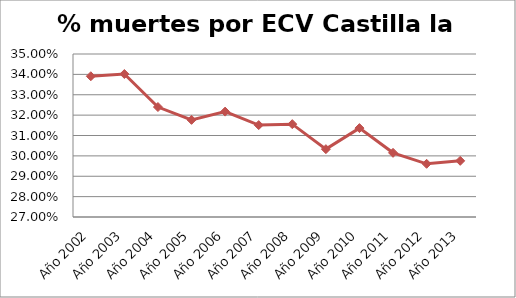
| Category | Series 0 |
|---|---|
| Año 2002 | 0.339 |
| Año 2003 | 0.34 |
| Año 2004 | 0.324 |
| Año 2005 | 0.318 |
| Año 2006 | 0.322 |
| Año 2007 | 0.315 |
| Año 2008 | 0.316 |
| Año 2009 | 0.303 |
| Año 2010 | 0.314 |
| Año 2011 | 0.302 |
| Año 2012 | 0.296 |
| Año 2013 | 0.298 |